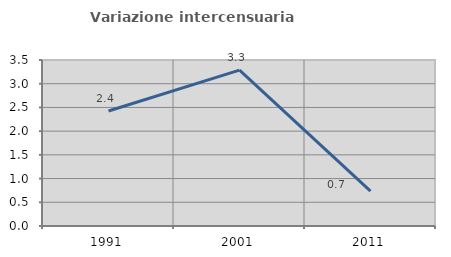
| Category | Variazione intercensuaria annua |
|---|---|
| 1991.0 | 2.426 |
| 2001.0 | 3.287 |
| 2011.0 | 0.737 |